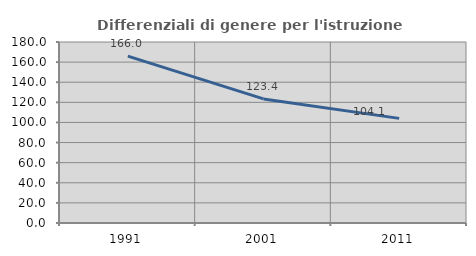
| Category | Differenziali di genere per l'istruzione superiore |
|---|---|
| 1991.0 | 165.98 |
| 2001.0 | 123.387 |
| 2011.0 | 104.059 |